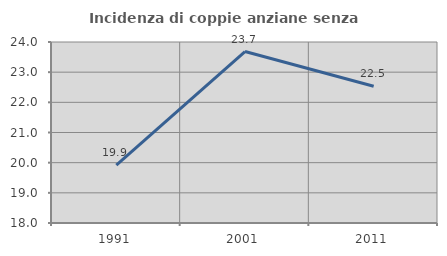
| Category | Incidenza di coppie anziane senza figli  |
|---|---|
| 1991.0 | 19.919 |
| 2001.0 | 23.684 |
| 2011.0 | 22.532 |